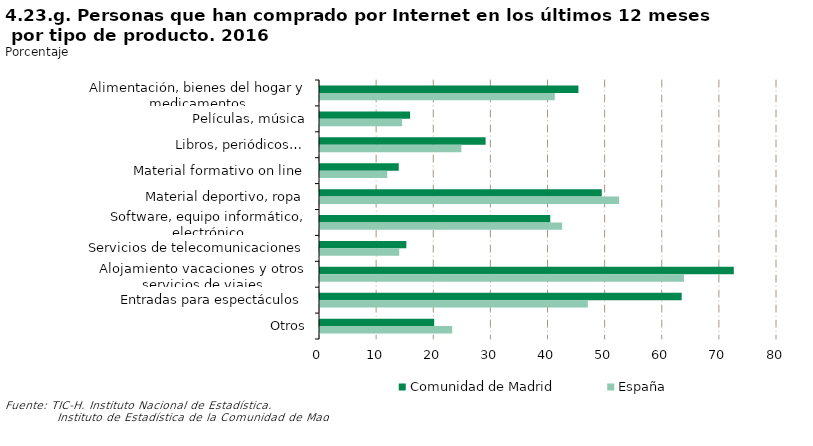
| Category | Comunidad de Madrid | España |
|---|---|---|
| Alimentación, bienes del hogar y medicamentos | 45.238 | 41.096 |
| Películas, música | 15.767 | 14.373 |
| Libros, periódicos… | 28.992 | 24.753 |
| Material formativo on line | 13.782 | 11.774 |
| Material deportivo, ropa | 49.324 | 52.37 |
| Software, equipo informático, electrónico | 40.31 | 42.389 |
| Servicios de telecomunicaciones | 15.113 | 13.871 |
| Alojamiento vacaciones y otros servicios de viajes | 72.434 | 63.721 |
| Entradas para espectáculos | 63.31 | 46.887 |
| Otros | 19.989 | 23.145 |